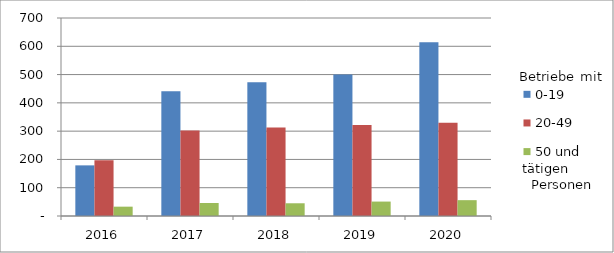
| Category | 0-19 | 20-49 | 50 und mehr |
|---|---|---|---|
| 2016.0 | 179 | 197 | 33 |
| 2017.0 | 441 | 302 | 46 |
| 2018.0 | 473 | 313 | 45 |
| 2019.0 | 500 | 322 | 51 |
| 2020.0 | 614 | 330 | 56 |